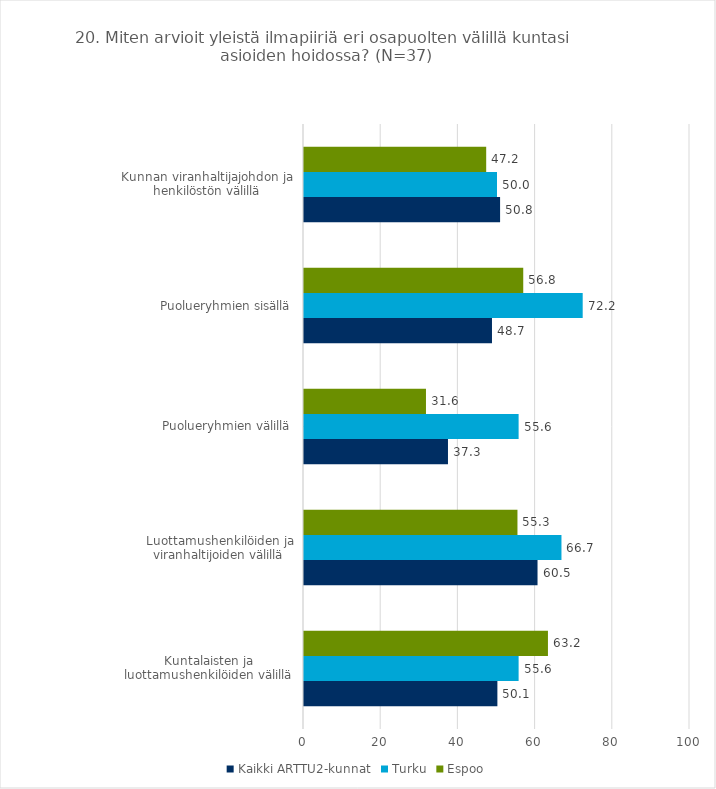
| Category | Kaikki ARTTU2-kunnat | Turku | Espoo |
|---|---|---|---|
| Kuntalaisten ja luottamushenkilöiden välillä | 50.1 | 55.6 | 63.2 |
| Luottamushenkilöiden ja viranhaltijoiden välillä | 60.5 | 66.7 | 55.3 |
| Puolueryhmien välillä | 37.3 | 55.6 | 31.6 |
| Puolueryhmien sisällä | 48.7 | 72.2 | 56.8 |
| Kunnan viranhaltijajohdon ja henkilöstön välillä | 50.8 | 50 | 47.2 |